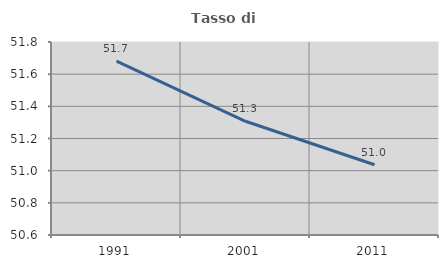
| Category | Tasso di occupazione   |
|---|---|
| 1991.0 | 51.681 |
| 2001.0 | 51.307 |
| 2011.0 | 51.037 |